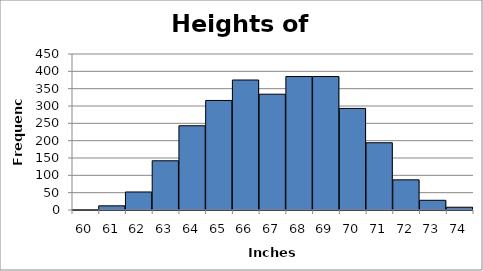
| Category | Series 0 |
|---|---|
| 60.0 | 1 |
| 61.0 | 12 |
| 62.0 | 52 |
| 63.0 | 142 |
| 64.0 | 243 |
| 65.0 | 316 |
| 66.0 | 375 |
| 67.0 | 334 |
| 68.0 | 385 |
| 69.0 | 385 |
| 70.0 | 293 |
| 71.0 | 194 |
| 72.0 | 87 |
| 73.0 | 28 |
| 74.0 | 8 |